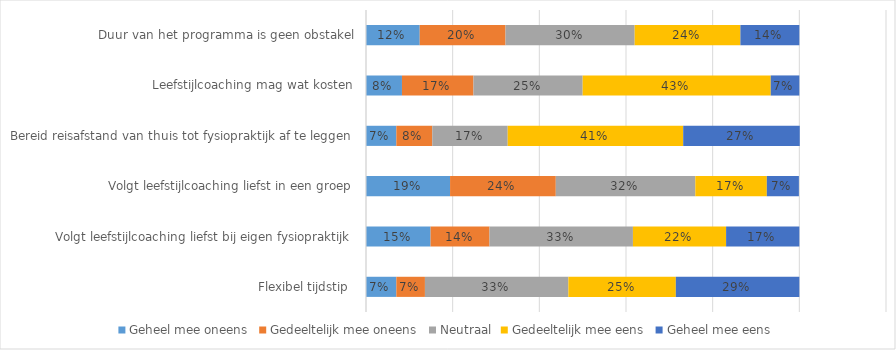
| Category | Geheel mee oneens | Gedeeltelijk mee oneens | Neutraal | Gedeeltelijk mee eens | Geheel mee eens |
|---|---|---|---|---|---|
| Flexibel tijdstip  | 0.07 | 0.066 | 0.331 | 0.248 | 0.285 |
| Volgt leefstijlcoaching liefst bij eigen fysiopraktijk | 0.149 | 0.136 | 0.331 | 0.215 | 0.169 |
| Volgt leefstijlcoaching liefst in een groep | 0.194 | 0.244 | 0.322 | 0.165 | 0.074 |
| Bereid reisafstand van thuis tot fysiopraktijk af te leggen | 0.07 | 0.083 | 0.174 | 0.405 | 0.269 |
| Leefstijlcoaching mag wat kosten | 0.083 | 0.165 | 0.252 | 0.434 | 0.066 |
| Duur van het programma is geen obstakel | 0.124 | 0.198 | 0.298 | 0.244 | 0.136 |